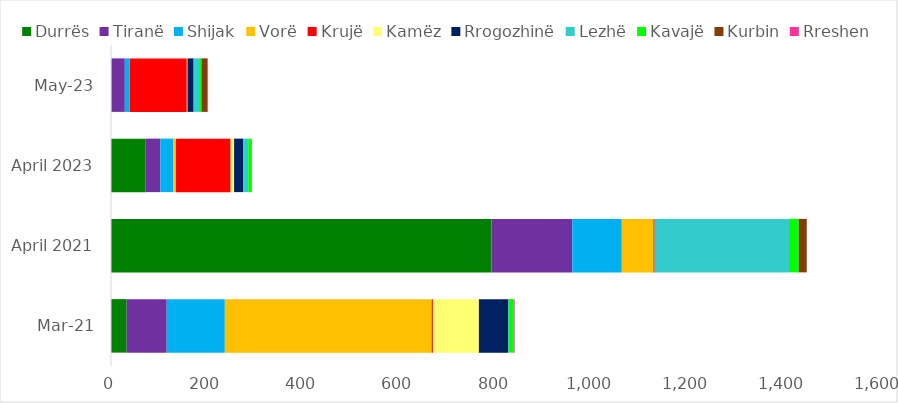
| Category | Durrës | Tiranë | Shijak | Vorë | Krujë | Kamëz | Rrogozhinë | Lezhë | Kavajë | Kurbin | Rreshen |
|---|---|---|---|---|---|---|---|---|---|---|---|
| Mar-21 | 32.5 | 83.405 | 120.891 | 430.407 | 2.5 | 95.778 | 61.27 | 0.95 | 9.5 | 0 | 2.65 |
| April 2021 | 791.633 | 168.143 | 102.987 | 65.889 | 2.45 | 0 | 0 | 279.679 | 20.08 | 16.709 | 0 |
| April 2023 | 72.188 | 30.552 | 26.501 | 5.991 | 113.595 | 7.28 | 19.23 | 10.159 | 6.037 | 1.047 | 0 |
| May-23 | 1.147 | 27.585 | 9.263 | 0.48 | 119.218 | 1.5 | 12.697 | 11.3 | 4.919 | 12.847 | 1.047 |